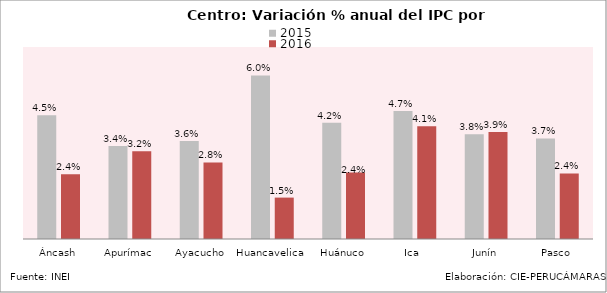
| Category | 2015 | 2016 |
|---|---|---|
| Áncash | 0.045 | 0.024 |
| Apurímac | 0.034 | 0.032 |
| Ayacucho | 0.036 | 0.028 |
| Huancavelica | 0.06 | 0.015 |
| Huánuco | 0.042 | 0.024 |
| Ica  | 0.047 | 0.041 |
| Junín | 0.038 | 0.039 |
| Pasco | 0.037 | 0.024 |